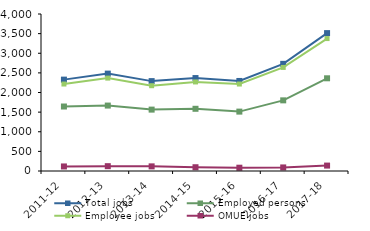
| Category | Total jobs | Employed persons | Employee jobs | OMUE jobs |
|---|---|---|---|---|
| 2011-12 | 2328 | 1643 | 2216 | 116 |
| 2012-13 | 2481 | 1667 | 2367 | 123 |
| 2013-14 | 2290 | 1564 | 2173 | 118 |
| 2014-15 | 2368 | 1585 | 2269 | 96 |
| 2015-16 | 2294 | 1513 | 2216 | 84 |
| 2016-17 | 2730 | 1800 | 2639 | 91 |
| 2017-18 | 3513 | 2362 | 3374 | 138 |